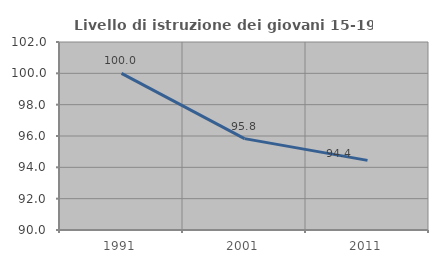
| Category | Livello di istruzione dei giovani 15-19 anni |
|---|---|
| 1991.0 | 100 |
| 2001.0 | 95.833 |
| 2011.0 | 94.444 |